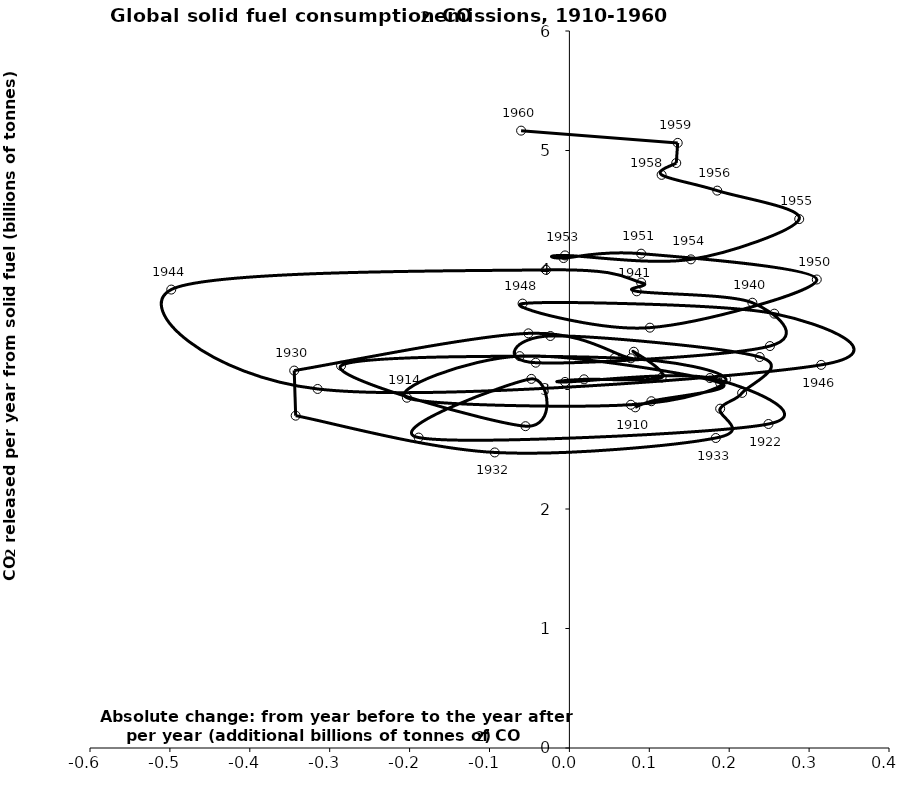
| Category | Series 0 |
|---|---|
| 0.08244000000000029 | 2.851 |
| 0.1025919999999998 | 2.902 |
| 0.18869599999999997 | 3.056 |
| -0.06228799999999968 | 3.279 |
| -0.2033520000000002 | 2.931 |
| 0.07694399999999968 | 2.873 |
| 0.19602399999999998 | 3.085 |
| 0.056792000000000176 | 3.265 |
| -0.28579200000000005 | 3.199 |
| -0.05496000000000012 | 2.693 |
| -0.0476319999999999 | 3.089 |
| -0.18869599999999997 | 2.598 |
| 0.24915200000000004 | 2.711 |
| 0.17587200000000003 | 3.096 |
| -0.005496000000000167 | 3.063 |
| 0.018319999999999892 | 3.085 |
| 0.11541600000000019 | 3.1 |
| 0.08060800000000024 | 3.316 |
| 0.0769439999999999 | 3.261 |
| -0.05129600000000001 | 3.47 |
| -0.34441599999999983 | 3.158 |
| -0.342584 | 2.781 |
| -0.09343200000000018 | 2.473 |
| 0.18320000000000003 | 2.594 |
| 0.1886960000000002 | 2.84 |
| 0.21617599999999992 | 2.972 |
| 0.2381599999999997 | 3.272 |
| -0.02381600000000006 | 3.448 |
| -0.04213599999999973 | 3.224 |
| 0.2509839999999999 | 3.364 |
| 0.22899999999999987 | 3.726 |
| 0.08427200000000012 | 3.822 |
| 0.08976800000000007 | 3.895 |
| -0.029312000000000005 | 4.001 |
| -0.4983040000000001 | 3.836 |
| -0.31510400000000005 | 3.004 |
| 0.31510400000000005 | 3.206 |
| 0.2564799999999998 | 3.635 |
| -0.05862400000000001 | 3.719 |
| 0.1007600000000004 | 3.517 |
| 0.3096080000000001 | 3.92 |
| 0.08976799999999985 | 4.137 |
| -0.007328000000000223 | 4.1 |
| -0.005495999999999945 | 4.122 |
| 0.15205599999999997 | 4.089 |
| 0.28762399999999966 | 4.426 |
| 0.18503200000000009 | 4.664 |
| 0.11541600000000063 | 4.796 |
| 0.13373599999999985 | 4.895 |
| 0.1355679999999997 | 5.064 |
| -0.06045599999999984 | 5.166 |